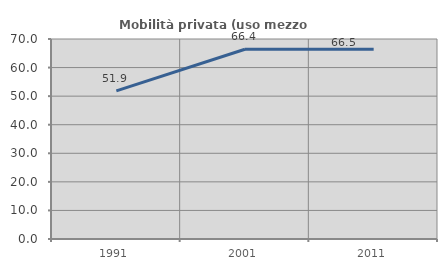
| Category | Mobilità privata (uso mezzo privato) |
|---|---|
| 1991.0 | 51.852 |
| 2001.0 | 66.396 |
| 2011.0 | 66.455 |